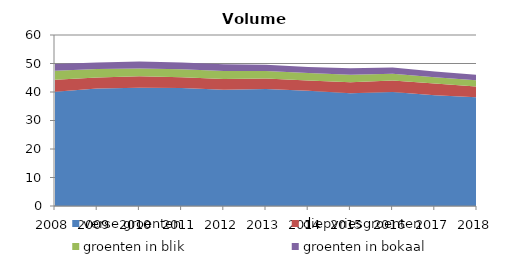
| Category | verse groenten | diepvriesgroenten | groenten in blik | groenten in bokaal |
|---|---|---|---|---|
| 2008.0 | 40.117 | 4.15 | 3.197 | 2.33 |
| 2009.0 | 41.241 | 3.817 | 3.028 | 2.302 |
| 2010.0 | 41.462 | 4.037 | 2.781 | 2.421 |
| 2011.0 | 41.365 | 3.801 | 2.79 | 2.353 |
| 2012.0 | 40.823 | 3.775 | 2.769 | 2.343 |
| 2013.0 | 41.037 | 3.678 | 2.686 | 2.19 |
| 2014.0 | 40.401 | 3.643 | 2.617 | 2.154 |
| 2015.0 | 39.578 | 3.864 | 2.621 | 2.261 |
| 2016.0 | 39.967 | 4.03 | 2.384 | 2.182 |
| 2017.0 | 38.889 | 4.065 | 2.25 | 1.97 |
| 2018.0 | 38.152 | 3.761 | 2.195 | 1.916 |